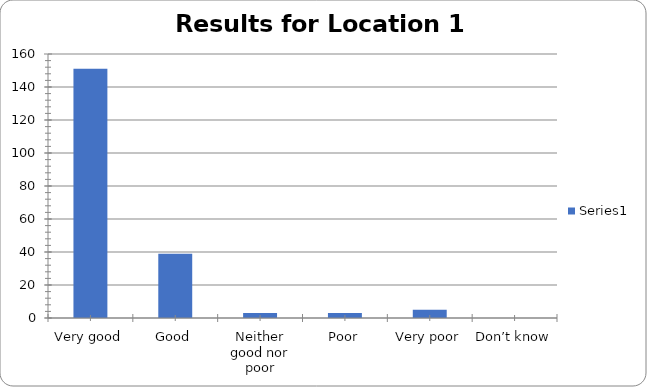
| Category | Series 0 |
|---|---|
| Very good | 151 |
| Good | 39 |
| Neither good nor poor | 3 |
| Poor | 3 |
| Very poor | 5 |
| Don’t know | 0 |